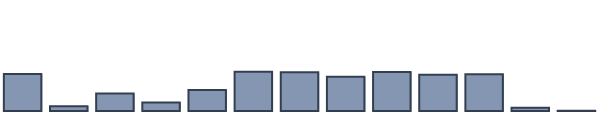
| Category | Series 0 |
|---|---|
| 0 | 11.7 |
| 1 | 1.5 |
| 2 | 5.5 |
| 3 | 2.7 |
| 4 | 6.6 |
| 5 | 12.4 |
| 6 | 12.2 |
| 7 | 10.8 |
| 8 | 12.3 |
| 9 | 11.4 |
| 10 | 11.6 |
| 11 | 1 |
| 12 | 0.1 |